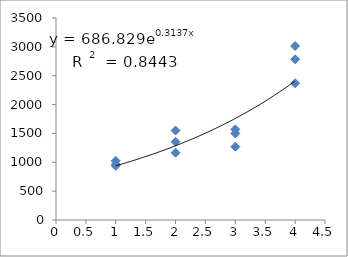
| Category | Series 0 |
|---|---|
| 1.0 | 1024 |
| 1.0 | 938 |
| 1.0 | 962 |
| 2.0 | 1355 |
| 2.0 | 1165 |
| 2.0 | 1550 |
| 3.0 | 1270 |
| 3.0 | 1500 |
| 3.0 | 1570 |
| 4.0 | 2785 |
| 4.0 | 2370 |
| 4.0 | 3015 |